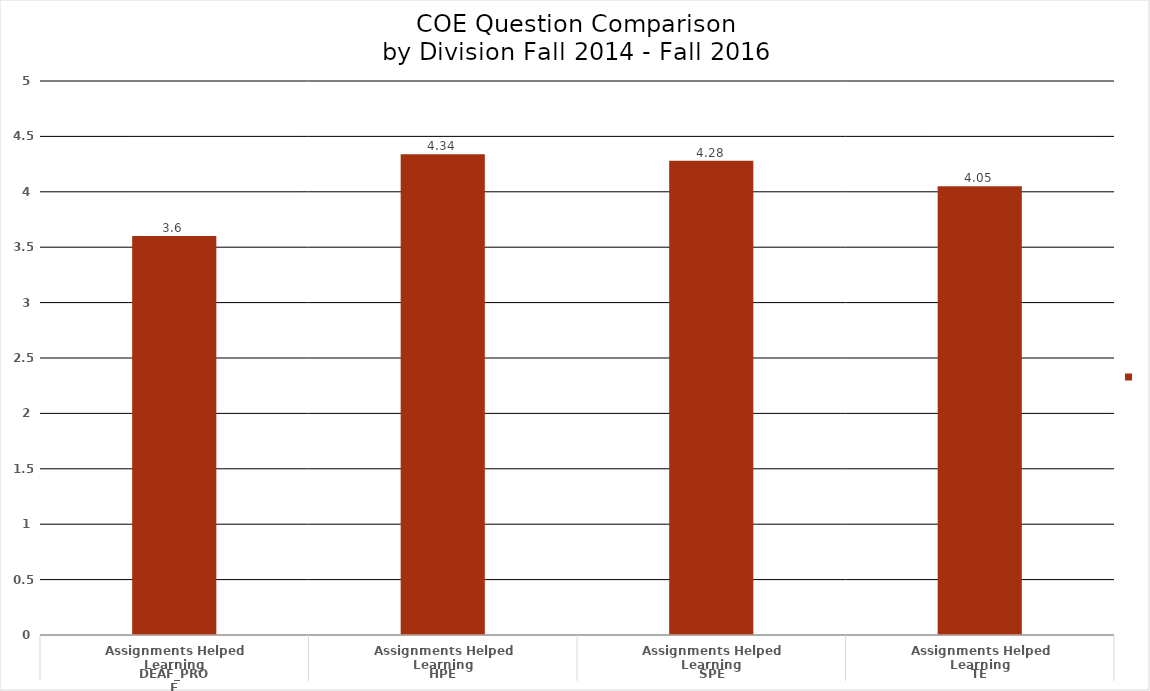
| Category | Fall 2016 |
|---|---|
| 0 | 3.6 |
| 1 | 4.34 |
| 2 | 4.28 |
| 3 | 4.05 |